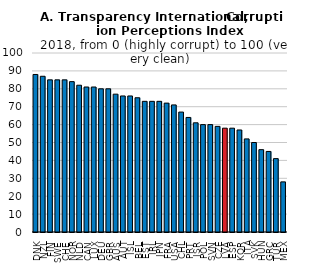
| Category | B. TI indicators |
|---|---|
| DNK | 88 |
| NZL | 87 |
| FIN | 85 |
| SWE | 85 |
| CHE | 85 |
| NOR | 84 |
| NLD | 82 |
| CAN | 81 |
| LUX | 81 |
| DEU | 80 |
| GBR | 80 |
| AUS | 77 |
| AUT | 76 |
| ISL | 76 |
| BEL | 75 |
| EST | 73 |
| IRL | 73 |
| JPN | 73 |
| FRA | 72 |
| USA | 71 |
| CHL | 67 |
| PRT | 64 |
| ISR | 61 |
| POL | 60 |
| SVN | 60 |
| CZE | 59 |
| LVA | 58 |
| ESP | 58 |
| KOR | 57 |
| ITA | 52 |
| SVK | 50 |
| HUN | 46 |
| GRC | 45 |
| TUR | 41 |
| MEX | 28 |